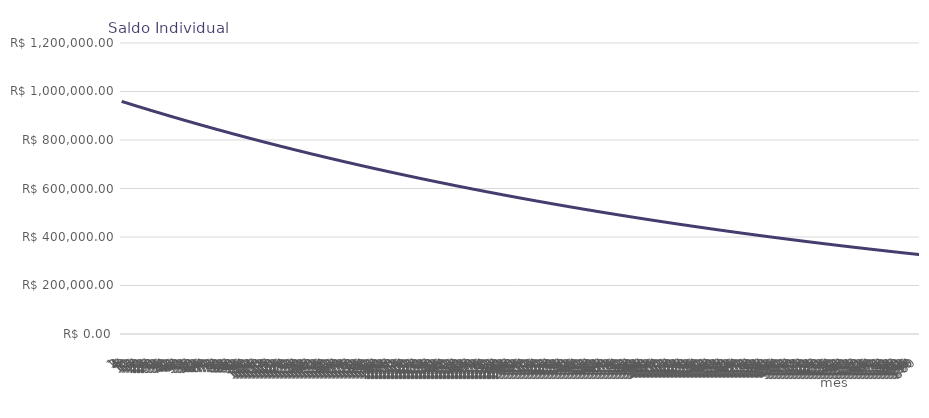
| Category | Series 0 |
|---|---|
| 0 | 959101.57 |
| 1 | 957421.813 |
| 2 | 955736.557 |
| 3 | 954045.784 |
| 4 | 952349.476 |
| 5 | 950647.614 |
| 6 | 948940.181 |
| 7 | 947227.159 |
| 8 | 945508.528 |
| 9 | 943784.271 |
| 10 | 942054.369 |
| 11 | 940318.804 |
| 12 | 938680.178 |
| 13 | 937036.186 |
| 14 | 935386.813 |
| 15 | 933732.04 |
| 16 | 932071.85 |
| 17 | 930406.225 |
| 18 | 928735.147 |
| 19 | 927058.599 |
| 20 | 925376.561 |
| 21 | 923689.018 |
| 22 | 921995.949 |
| 23 | 920297.338 |
| 24 | 918693.602 |
| 25 | 917084.615 |
| 26 | 915470.36 |
| 27 | 913850.821 |
| 28 | 912225.98 |
| 29 | 910595.82 |
| 30 | 908960.323 |
| 31 | 907319.472 |
| 32 | 905673.249 |
| 33 | 904021.637 |
| 34 | 902364.618 |
| 35 | 900702.174 |
| 36 | 899132.584 |
| 37 | 897557.856 |
| 38 | 895977.973 |
| 39 | 894392.917 |
| 40 | 892802.673 |
| 41 | 891207.222 |
| 42 | 889606.548 |
| 43 | 888000.635 |
| 44 | 886389.463 |
| 45 | 884773.018 |
| 46 | 883151.28 |
| 47 | 881524.233 |
| 48 | 879988.064 |
| 49 | 878446.865 |
| 50 | 876900.621 |
| 51 | 875349.315 |
| 52 | 873792.93 |
| 53 | 872231.45 |
| 54 | 870664.859 |
| 55 | 869093.138 |
| 56 | 867516.272 |
| 57 | 865934.244 |
| 58 | 864347.037 |
| 59 | 862754.634 |
| 60 | 861251.173 |
| 61 | 859742.79 |
| 62 | 858229.468 |
| 63 | 856711.193 |
| 64 | 855187.947 |
| 65 | 853659.715 |
| 66 | 852126.479 |
| 67 | 850588.224 |
| 68 | 849044.933 |
| 69 | 847496.59 |
| 70 | 845943.178 |
| 71 | 844384.681 |
| 72 | 842913.231 |
| 73 | 841436.965 |
| 74 | 839955.866 |
| 75 | 838469.918 |
| 76 | 836979.105 |
| 77 | 835483.412 |
| 78 | 833982.823 |
| 79 | 832477.321 |
| 80 | 830966.89 |
| 81 | 829451.514 |
| 82 | 827931.178 |
| 83 | 826405.864 |
| 84 | 824965.745 |
| 85 | 823520.912 |
| 86 | 822071.349 |
| 87 | 820617.04 |
| 88 | 819157.97 |
| 89 | 817694.124 |
| 90 | 816225.485 |
| 91 | 814752.038 |
| 92 | 813273.768 |
| 93 | 811790.658 |
| 94 | 810302.693 |
| 95 | 808809.856 |
| 96 | 807400.401 |
| 97 | 805986.331 |
| 98 | 804567.632 |
| 99 | 803144.289 |
| 100 | 801716.286 |
| 101 | 800283.608 |
| 102 | 798846.24 |
| 103 | 797404.166 |
| 104 | 795957.372 |
| 105 | 794505.84 |
| 106 | 793049.557 |
| 107 | 791588.507 |
| 108 | 790209.062 |
| 109 | 788825.101 |
| 110 | 787436.609 |
| 111 | 786043.572 |
| 112 | 784645.974 |
| 113 | 783243.801 |
| 114 | 781837.038 |
| 115 | 780425.669 |
| 116 | 779009.68 |
| 117 | 777589.055 |
| 118 | 776163.779 |
| 119 | 774733.838 |
| 120 | 773383.764 |
| 121 | 772029.271 |
| 122 | 770670.343 |
| 123 | 769306.967 |
| 124 | 767939.127 |
| 125 | 766566.809 |
| 126 | 765189.999 |
| 127 | 763808.681 |
| 128 | 762422.841 |
| 129 | 761032.465 |
| 130 | 759637.537 |
| 131 | 758238.042 |
| 132 | 756916.714 |
| 133 | 755591.061 |
| 134 | 754261.068 |
| 135 | 752926.721 |
| 136 | 751588.005 |
| 137 | 750244.907 |
| 138 | 748897.412 |
| 139 | 747545.506 |
| 140 | 746189.174 |
| 141 | 744828.401 |
| 142 | 743463.174 |
| 143 | 742093.478 |
| 144 | 740800.284 |
| 145 | 739502.857 |
| 146 | 738201.182 |
| 147 | 736895.246 |
| 148 | 735585.035 |
| 149 | 734270.535 |
| 150 | 732951.731 |
| 151 | 731628.61 |
| 152 | 730301.157 |
| 153 | 728969.358 |
| 154 | 727633.2 |
| 155 | 726292.667 |
| 156 | 725027.008 |
| 157 | 723757.206 |
| 158 | 722483.247 |
| 159 | 721205.118 |
| 160 | 719922.804 |
| 161 | 718636.292 |
| 162 | 717345.568 |
| 163 | 716050.619 |
| 164 | 714751.431 |
| 165 | 713447.989 |
| 166 | 712140.281 |
| 167 | 710828.291 |
| 168 | 709589.581 |
| 169 | 708346.816 |
| 170 | 707099.982 |
| 171 | 705849.067 |
| 172 | 704594.056 |
| 173 | 703334.937 |
| 174 | 702071.695 |
| 175 | 700804.319 |
| 176 | 699532.793 |
| 177 | 698257.104 |
| 178 | 696977.24 |
| 179 | 695693.185 |
| 180 | 694480.85 |
| 181 | 693264.546 |
| 182 | 692044.26 |
| 183 | 690819.98 |
| 184 | 689591.691 |
| 185 | 688359.381 |
| 186 | 687123.037 |
| 187 | 685882.646 |
| 188 | 684638.193 |
| 189 | 683389.667 |
| 190 | 682137.054 |
| 191 | 680880.339 |
| 192 | 679693.818 |
| 193 | 678503.411 |
| 194 | 677309.108 |
| 195 | 676110.895 |
| 196 | 674908.759 |
| 197 | 673702.688 |
| 198 | 672492.669 |
| 199 | 671278.688 |
| 200 | 670060.733 |
| 201 | 668838.791 |
| 202 | 667612.848 |
| 203 | 666382.892 |
| 204 | 665221.634 |
| 205 | 664056.574 |
| 206 | 662887.7 |
| 207 | 661715 |
| 208 | 660538.46 |
| 209 | 659358.069 |
| 210 | 658173.813 |
| 211 | 656985.681 |
| 212 | 655793.659 |
| 213 | 654597.734 |
| 214 | 653397.895 |
| 215 | 652194.127 |
| 216 | 651057.595 |
| 217 | 649917.342 |
| 218 | 648773.356 |
| 219 | 647625.625 |
| 220 | 646474.136 |
| 221 | 645318.878 |
| 222 | 644159.838 |
| 223 | 642997.003 |
| 224 | 641830.362 |
| 225 | 640659.901 |
| 226 | 639485.609 |
| 227 | 638307.472 |
| 228 | 637195.139 |
| 229 | 636079.165 |
| 230 | 634959.537 |
| 231 | 633836.243 |
| 232 | 632709.273 |
| 233 | 631578.613 |
| 234 | 630444.251 |
| 235 | 629306.176 |
| 236 | 628164.375 |
| 237 | 627018.836 |
| 238 | 625869.547 |
| 239 | 624716.495 |
| 240 | 623627.846 |
| 241 | 622535.633 |
| 242 | 621439.845 |
| 243 | 620340.469 |
| 244 | 619237.494 |
| 245 | 618130.908 |
| 246 | 617020.699 |
| 247 | 615906.856 |
| 248 | 614789.367 |
| 249 | 613668.219 |
| 250 | 612543.401 |
| 251 | 611414.9 |
| 252 | 610349.431 |
| 253 | 609280.473 |
| 254 | 608208.017 |
| 255 | 607132.049 |
| 256 | 606052.559 |
| 257 | 604969.534 |
| 258 | 603882.965 |
| 259 | 602792.838 |
| 260 | 601699.142 |
| 261 | 600601.866 |
| 262 | 599500.998 |
| 263 | 598396.525 |
| 264 | 597353.742 |
| 265 | 596307.545 |
| 266 | 595257.923 |
| 267 | 594204.865 |
| 268 | 593148.36 |
| 269 | 592088.396 |
| 270 | 591024.961 |
| 271 | 589958.046 |
| 272 | 588887.637 |
| 273 | 587813.725 |
| 274 | 586736.296 |
| 275 | 585655.34 |
| 276 | 584634.761 |
| 277 | 583610.84 |
| 278 | 582583.566 |
| 279 | 581552.93 |
| 280 | 580518.92 |
| 281 | 579481.525 |
| 282 | 578440.734 |
| 283 | 577396.535 |
| 284 | 576348.918 |
| 285 | 575297.871 |
| 286 | 574243.383 |
| 287 | 573185.444 |
| 288 | 572186.594 |
| 289 | 571184.475 |
| 290 | 570179.074 |
| 291 | 569170.383 |
| 292 | 568158.389 |
| 293 | 567143.082 |
| 294 | 566124.452 |
| 295 | 565102.486 |
| 296 | 564077.175 |
| 297 | 563048.508 |
| 298 | 562016.472 |
| 299 | 560981.059 |
| 300 | 560003.477 |
| 301 | 559022.695 |
| 302 | 558038.702 |
| 303 | 557051.487 |
| 304 | 556061.041 |
| 305 | 555067.352 |
| 306 | 554070.411 |
| 307 | 553070.205 |
| 308 | 552066.725 |
| 309 | 551059.96 |
| 310 | 550049.899 |
| 311 | 549036.532 |
| 312 | 548079.765 |
| 313 | 547119.866 |
| 314 | 546156.824 |
| 315 | 545190.63 |
| 316 | 544221.272 |
| 317 | 543248.741 |
| 318 | 542273.027 |
| 319 | 541294.118 |
| 320 | 540312.004 |
| 321 | 539326.676 |
| 322 | 538338.121 |
| 323 | 537346.33 |
| 324 | 536409.935 |
| 325 | 535470.474 |
| 326 | 534527.938 |
| 327 | 533582.316 |
| 328 | 532633.598 |
| 329 | 531681.775 |
| 330 | 530726.835 |
| 331 | 529768.77 |
| 332 | 528807.567 |
| 333 | 527843.218 |
| 334 | 526875.712 |
| 335 | 525905.039 |
| 336 | 524988.582 |
| 337 | 524069.124 |
| 338 | 523146.657 |
| 339 | 522221.169 |
| 340 | 521292.652 |
| 341 | 520361.095 |
| 342 | 519426.488 |
| 343 | 518488.821 |
| 344 | 517548.085 |
| 345 | 516604.269 |
| 346 | 515657.364 |
| 347 | 514707.358 |
| 348 | 513810.414 |
| 349 | 512910.534 |
| 350 | 512007.708 |
| 351 | 511101.926 |
| 352 | 510193.179 |
| 353 | 509281.457 |
| 354 | 508366.75 |
| 355 | 507449.048 |
| 356 | 506528.343 |
| 357 | 505604.623 |
| 358 | 504677.879 |
| 359 | 503748.101 |
| 360 | 502870.255 |
| 361 | 501989.535 |
| 362 | 501105.932 |
| 363 | 500219.436 |
| 364 | 499330.038 |
| 365 | 498437.729 |
| 366 | 497542.498 |
| 367 | 496644.336 |
| 368 | 495743.234 |
| 369 | 494839.183 |
| 370 | 493932.171 |
| 371 | 493022.19 |
| 372 | 492163.036 |
| 373 | 491301.068 |
| 374 | 490436.279 |
| 375 | 489568.659 |
| 376 | 488698.198 |
| 377 | 487824.888 |
| 378 | 486948.718 |
| 379 | 486069.681 |
| 380 | 485187.765 |
| 381 | 484302.962 |
| 382 | 483415.263 |
| 383 | 482524.658 |
| 384 | 481683.797 |
| 385 | 480840.182 |
| 386 | 479993.806 |
| 387 | 479144.66 |
| 388 | 478292.733 |
| 389 | 477438.017 |
| 390 | 476580.504 |
| 391 | 475720.183 |
| 392 | 474857.045 |
| 393 | 473991.082 |
| 394 | 473122.284 |
| 395 | 472250.641 |
| 396 | 471427.684 |
| 397 | 470602.032 |
| 398 | 469773.677 |
| 399 | 468942.611 |
| 400 | 468108.823 |
| 401 | 467272.307 |
| 402 | 466433.051 |
| 403 | 465591.048 |
| 404 | 464746.289 |
| 405 | 463898.764 |
| 406 | 463048.464 |
| 407 | 462195.381 |
| 408 | 461389.946 |
| 409 | 460581.874 |
| 410 | 459771.157 |
| 411 | 458957.786 |
| 412 | 458141.752 |
| 413 | 457323.046 |
| 414 | 456501.66 |
| 415 | 455677.586 |
| 416 | 454850.813 |
| 417 | 454021.334 |
| 418 | 453189.139 |
| 419 | 452354.22 |
| 420 | 451565.934 |
| 421 | 450775.068 |
| 422 | 449981.613 |
| 423 | 449185.56 |
| 424 | 448386.901 |
| 425 | 447585.628 |
| 426 | 446781.731 |
| 427 | 445975.203 |
| 428 | 445166.034 |
| 429 | 444354.216 |
| 430 | 443539.74 |
| 431 | 442722.599 |
| 432 | 441951.097 |
| 433 | 441177.071 |
| 434 | 440400.51 |
| 435 | 439621.407 |
| 436 | 438839.753 |
| 437 | 438055.54 |
| 438 | 437268.76 |
| 439 | 436479.405 |
| 440 | 435687.465 |
| 441 | 434892.932 |
| 442 | 434095.799 |
| 443 | 433296.056 |
| 444 | 432540.982 |
| 445 | 431783.435 |
| 446 | 431023.409 |
| 447 | 430260.895 |
| 448 | 429495.884 |
| 449 | 428728.369 |
| 450 | 427958.342 |
| 451 | 427185.793 |
| 452 | 426410.716 |
| 453 | 425633.101 |
| 454 | 424852.94 |
| 455 | 424070.225 |
| 456 | 423331.228 |
| 457 | 422589.812 |
| 458 | 421845.968 |
| 459 | 421099.689 |
| 460 | 420350.968 |
| 461 | 419599.795 |
| 462 | 418846.163 |
| 463 | 418090.063 |
| 464 | 417331.489 |
| 465 | 416570.431 |
| 466 | 415806.882 |
| 467 | 415040.833 |
| 468 | 414317.57 |
| 469 | 413591.94 |
| 470 | 412863.935 |
| 471 | 412133.546 |
| 472 | 411400.766 |
| 473 | 410665.588 |
| 474 | 409928.002 |
| 475 | 409188.002 |
| 476 | 408445.579 |
| 477 | 407700.726 |
| 478 | 406953.434 |
| 479 | 406203.696 |
| 480 | 405495.833 |
| 481 | 404785.654 |
| 482 | 404073.149 |
| 483 | 403358.312 |
| 484 | 402641.135 |
| 485 | 401921.609 |
| 486 | 401199.729 |
| 487 | 400475.485 |
| 488 | 399748.87 |
| 489 | 399019.876 |
| 490 | 398288.496 |
| 491 | 397554.721 |
| 492 | 396861.931 |
| 493 | 396166.872 |
| 494 | 395469.539 |
| 495 | 394769.922 |
| 496 | 394068.015 |
| 497 | 393363.81 |
| 498 | 392657.3 |
| 499 | 391948.476 |
| 500 | 391237.333 |
| 501 | 390523.861 |
| 502 | 389808.053 |
| 503 | 389089.902 |
| 504 | 388411.863 |
| 505 | 387731.604 |
| 506 | 387049.118 |
| 507 | 386364.398 |
| 508 | 385677.436 |
| 509 | 384988.225 |
| 510 | 384296.758 |
| 511 | 383603.027 |
| 512 | 382907.025 |
| 513 | 382208.745 |
| 514 | 381508.178 |
| 515 | 380805.318 |
| 516 | 380141.716 |
| 517 | 379475.941 |
| 518 | 378807.987 |
| 519 | 378137.846 |
| 520 | 377465.511 |
| 521 | 376790.975 |
| 522 | 376114.23 |
| 523 | 375435.27 |
| 524 | 374754.088 |
| 525 | 374070.675 |
| 526 | 373385.026 |
| 527 | 372697.131 |
| 528 | 372047.658 |
| 529 | 371396.059 |
| 530 | 370742.327 |
| 531 | 370086.455 |
| 532 | 369428.435 |
| 533 | 368768.262 |
| 534 | 368105.927 |
| 535 | 367441.424 |
| 536 | 366774.745 |
| 537 | 366105.884 |
| 538 | 365434.833 |
| 539 | 364761.585 |
| 540 | 364125.941 |
| 541 | 363488.216 |
| 542 | 362848.404 |
| 543 | 362206.496 |
| 544 | 361562.487 |
| 545 | 360916.37 |
| 546 | 360268.138 |
| 547 | 359617.784 |
| 548 | 358965.3 |
| 549 | 358310.68 |
| 550 | 357653.918 |
| 551 | 356995.005 |
| 552 | 356372.895 |
| 553 | 355748.749 |
| 554 | 355122.559 |
| 555 | 354494.319 |
| 556 | 353864.023 |
| 557 | 353231.663 |
| 558 | 352597.233 |
| 559 | 351960.726 |
| 560 | 351322.135 |
| 561 | 350681.454 |
| 562 | 350038.675 |
| 563 | 349393.792 |
| 564 | 348784.928 |
| 565 | 348174.071 |
| 566 | 347561.215 |
| 567 | 346946.352 |
| 568 | 346329.476 |
| 569 | 345710.58 |
| 570 | 345089.658 |
| 571 | 344466.704 |
| 572 | 343841.71 |
| 573 | 343214.671 |
| 574 | 342585.578 |
| 575 | 341954.426 |
| 576 | 341358.526 |
| 577 | 340760.676 |
| 578 | 340160.868 |
| 579 | 339559.097 |
| 580 | 338955.355 |
| 581 | 338349.638 |
| 582 | 337741.937 |
| 583 | 337132.246 |
| 584 | 336520.56 |
| 585 | 335906.872 |
| 586 | 335291.174 |
| 587 | 334673.46 |
| 588 | 334090.249 |
| 589 | 333505.128 |
| 590 | 332918.091 |
| 591 | 332329.133 |
| 592 | 331738.247 |
| 593 | 331145.426 |
| 594 | 330550.664 |
| 595 | 329953.956 |
| 596 | 329355.294 |
| 597 | 328754.672 |
| 598 | 328152.083 |
| 599 | 327547.523 |